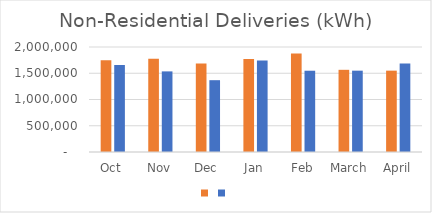
| Category | Series 1 | Series 0 |
|---|---|---|
| Oct | 1746850 | 1657467 |
| Nov | 1778480 | 1535448 |
| Dec | 1688051 | 1367905 |
| Jan | 1770828 | 1741151 |
| Feb | 1874770 | 1548063 |
| March | 1565360 | 1549153 |
| April | 1549578 | 1684688 |